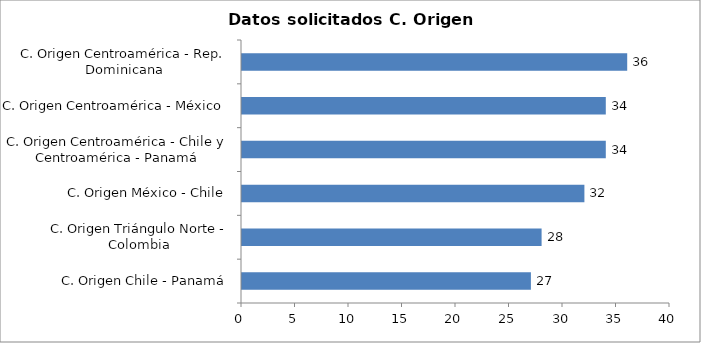
| Category | Series 0 |
|---|---|
| C. Origen Chile - Panamá | 27 |
| C. Origen Triángulo Norte - Colombia | 28 |
| C. Origen México - Chile | 32 |
| C. Origen Centroamérica - Chile y Centroamérica - Panamá | 34 |
| C. Origen Centroamérica - México | 34 |
| C. Origen Centroamérica - Rep. Dominicana | 36 |